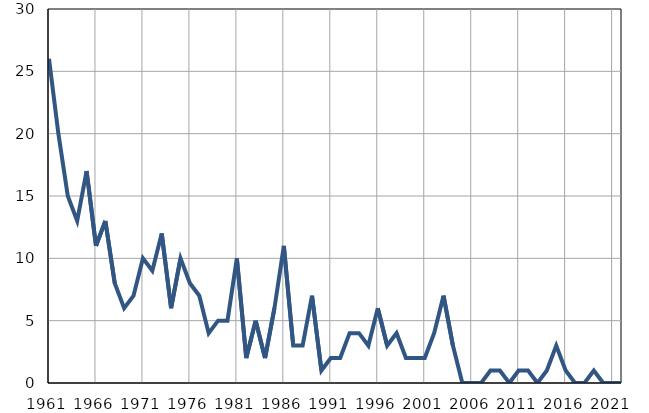
| Category | Умрла 
одојчад |
|---|---|
| 1961.0 | 26 |
| 1962.0 | 20 |
| 1963.0 | 15 |
| 1964.0 | 13 |
| 1965.0 | 17 |
| 1966.0 | 11 |
| 1967.0 | 13 |
| 1968.0 | 8 |
| 1969.0 | 6 |
| 1970.0 | 7 |
| 1971.0 | 10 |
| 1972.0 | 9 |
| 1973.0 | 12 |
| 1974.0 | 6 |
| 1975.0 | 10 |
| 1976.0 | 8 |
| 1977.0 | 7 |
| 1978.0 | 4 |
| 1979.0 | 5 |
| 1980.0 | 5 |
| 1981.0 | 10 |
| 1982.0 | 2 |
| 1983.0 | 5 |
| 1984.0 | 2 |
| 1985.0 | 6 |
| 1986.0 | 11 |
| 1987.0 | 3 |
| 1988.0 | 3 |
| 1989.0 | 7 |
| 1990.0 | 1 |
| 1991.0 | 2 |
| 1992.0 | 2 |
| 1993.0 | 4 |
| 1994.0 | 4 |
| 1995.0 | 3 |
| 1996.0 | 6 |
| 1997.0 | 3 |
| 1998.0 | 4 |
| 1999.0 | 2 |
| 2000.0 | 2 |
| 2001.0 | 2 |
| 2002.0 | 4 |
| 2003.0 | 7 |
| 2004.0 | 3 |
| 2005.0 | 0 |
| 2006.0 | 0 |
| 2007.0 | 0 |
| 2008.0 | 1 |
| 2009.0 | 1 |
| 2010.0 | 0 |
| 2011.0 | 1 |
| 2012.0 | 1 |
| 2013.0 | 0 |
| 2014.0 | 1 |
| 2015.0 | 3 |
| 2016.0 | 1 |
| 2017.0 | 0 |
| 2018.0 | 0 |
| 2019.0 | 1 |
| 2020.0 | 0 |
| 2021.0 | 0 |
| 2022.0 | 0 |